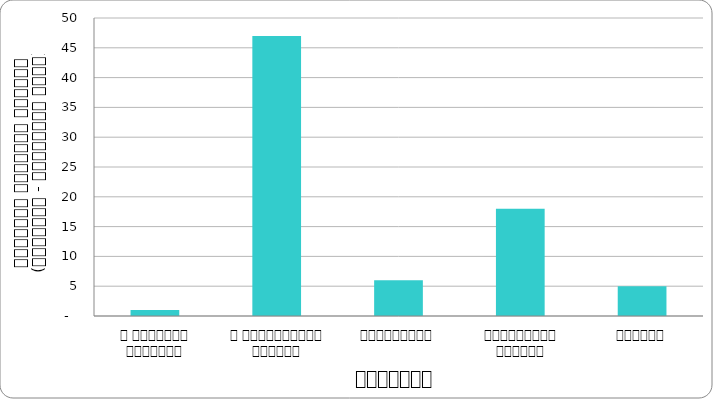
| Category | कुटनीति |
|---|---|
| द हिमालयन टाइम्स् | 1 |
| द काठमाण्डौं पोस्ट् | 47 |
| कान्तिपुर | 6 |
| अन्नपूर्ण पोस्ट् | 18 |
| नागरिक | 5 |